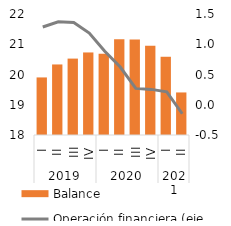
| Category | Balance |
|---|---|
| 0 | 19.903 |
| 1 | 20.332 |
| 2 | 20.526 |
| 3 | 20.729 |
| 4 | 20.686 |
| 5 | 21.162 |
| 6 | 21.158 |
| 7 | 20.949 |
| 8 | 20.586 |
| 9 | 19.407 |